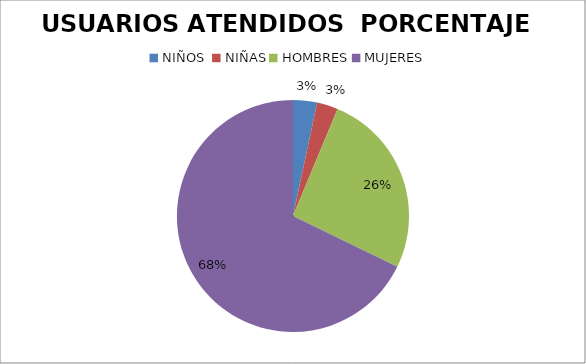
| Category | USUARIOS ATENDIDOS  |
|---|---|
| NIÑOS  | 8 |
| NIÑAS | 7 |
| HOMBRES | 62 |
| MUJERES | 162 |